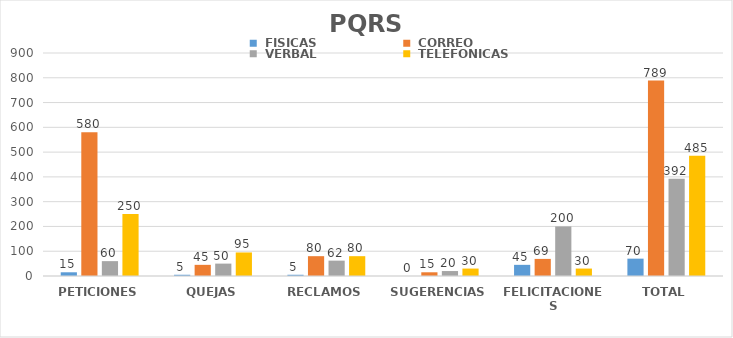
| Category | Series 0 | Series 1 | Series 2 | Series 3 |
|---|---|---|---|---|
| PETICIONES | 15 | 580 | 60 | 250 |
| QUEJAS | 5 | 45 | 50 | 95 |
| RECLAMOS | 5 | 80 | 62 | 80 |
| SUGERENCIAS | 0 | 15 | 20 | 30 |
| FELICITACIONES | 45 | 69 | 200 | 30 |
| TOTAL | 70 | 789 | 392 | 485 |